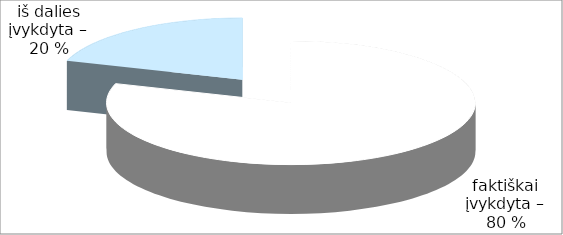
| Category | Series 0 |
|---|---|
| 0 | 12 |
| 1 | 3 |